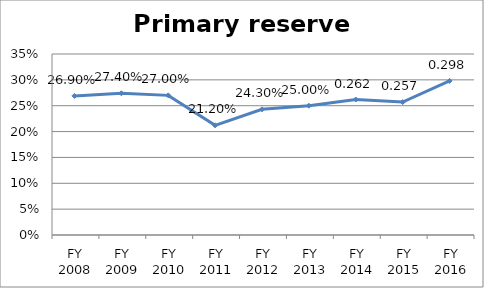
| Category | Primary reserve ratio |
|---|---|
| FY 2016 | 0.298 |
| FY 2015 | 0.257 |
| FY 2014 | 0.262 |
| FY 2013 | 0.25 |
| FY 2012 | 0.243 |
| FY 2011 | 0.212 |
| FY 2010 | 0.27 |
| FY 2009 | 0.274 |
| FY 2008 | 0.269 |